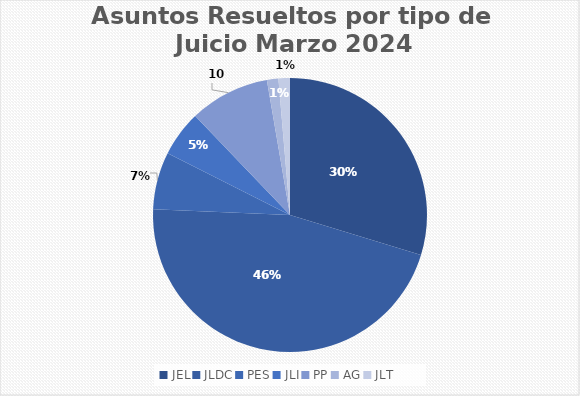
| Category | Asuntos Resueltos por tipo de Juicio  MARZO |
|---|---|
| JEL | 22 |
| JLDC | 34 |
| PES | 5 |
| JLI | 4 |
| PP | 7 |
| AG | 1 |
| JLT | 1 |